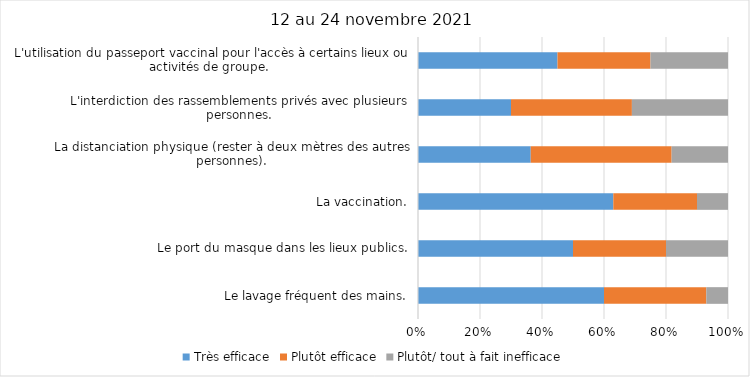
| Category | Très efficace | Plutôt efficace | Plutôt/ tout à fait inefficace |
|---|---|---|---|
| Le lavage fréquent des mains. | 60 | 33 | 7 |
| Le port du masque dans les lieux publics. | 50 | 30 | 20 |
| La vaccination. | 63 | 27 | 10 |
| La distanciation physique (rester à deux mètres des autres personnes). | 36 | 45 | 18 |
| L'interdiction des rassemblements privés avec plusieurs personnes. | 30 | 39 | 31 |
| L'utilisation du passeport vaccinal pour l'accès à certains lieux ou activités de groupe.  | 45 | 30 | 25 |